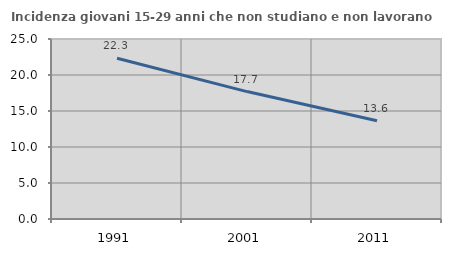
| Category | Incidenza giovani 15-29 anni che non studiano e non lavorano  |
|---|---|
| 1991.0 | 22.321 |
| 2001.0 | 17.697 |
| 2011.0 | 13.648 |